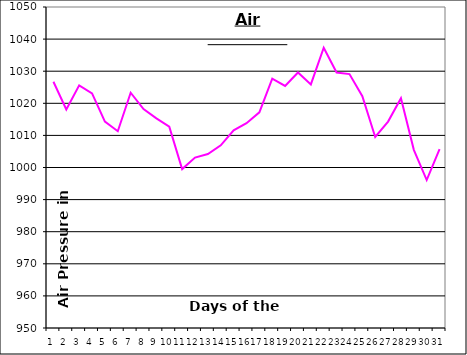
| Category | Series 0 |
|---|---|
| 0 | 1026.7 |
| 1 | 1018.1 |
| 2 | 1025.6 |
| 3 | 1023.1 |
| 4 | 1014.3 |
| 5 | 1011.3 |
| 6 | 1023.3 |
| 7 | 1018.2 |
| 8 | 1015.3 |
| 9 | 1012.7 |
| 10 | 999.5 |
| 11 | 1003.1 |
| 12 | 1004.2 |
| 13 | 1006.9 |
| 14 | 1011.6 |
| 15 | 1013.8 |
| 16 | 1017.2 |
| 17 | 1027.7 |
| 18 | 1025.4 |
| 19 | 1029.6 |
| 20 | 1025.9 |
| 21 | 1037.3 |
| 22 | 1029.6 |
| 23 | 1029.1 |
| 24 | 1022.2 |
| 25 | 1009.5 |
| 26 | 1014.3 |
| 27 | 1021.6 |
| 28 | 1005.5 |
| 29 | 996.1 |
| 30 | 1005.7 |